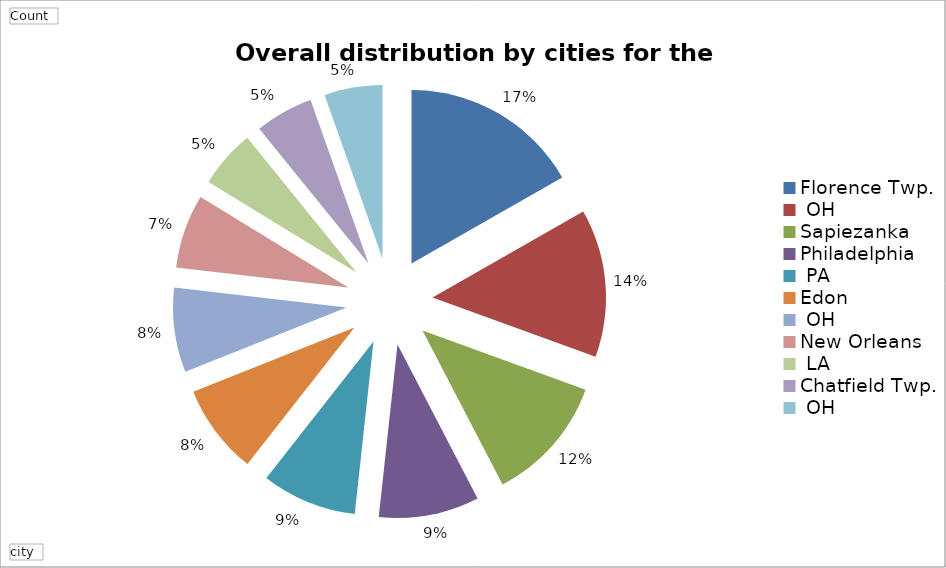
| Category | Ergebnis |
|---|---|
| Florence Twp., OH | 34 |
| Sapiezanka | 28 |
| Philadelphia, PA | 24 |
| Edon, OH | 19 |
| New Orleans, LA | 18 |
| Chatfield Twp., OH | 17 |
| Oxford, IA | 16 |
| Marcus, IA | 14 |
| Cincinnati, OH | 11 |
| Ann Arbor, MI | 11 |
| Algier | 11 |